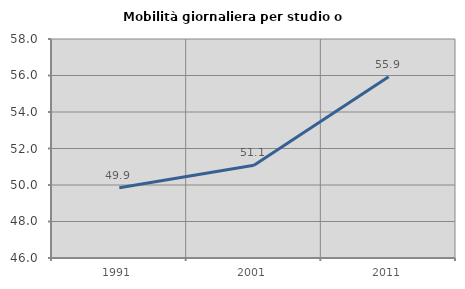
| Category | Mobilità giornaliera per studio o lavoro |
|---|---|
| 1991.0 | 49.851 |
| 2001.0 | 51.084 |
| 2011.0 | 55.936 |